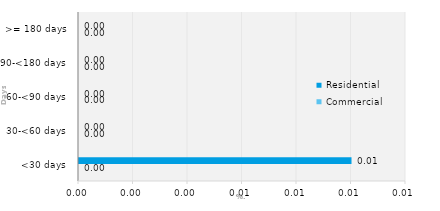
| Category | Commercial | Residential |
|---|---|---|
| <30 days | 0 | 0.01 |
| 30-<60 days | 0 | 0 |
| 60-<90 days | 0 | 0 |
| 90-<180 days | 0 | 0 |
| >= 180 days | 0 | 0 |